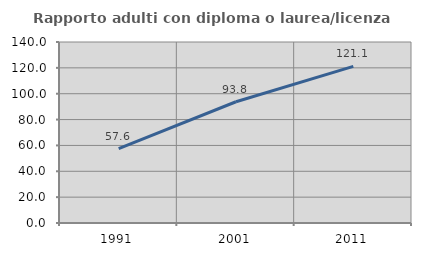
| Category | Rapporto adulti con diploma o laurea/licenza media  |
|---|---|
| 1991.0 | 57.602 |
| 2001.0 | 93.78 |
| 2011.0 | 121.13 |